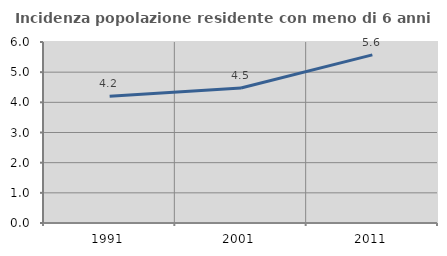
| Category | Incidenza popolazione residente con meno di 6 anni |
|---|---|
| 1991.0 | 4.204 |
| 2001.0 | 4.476 |
| 2011.0 | 5.572 |